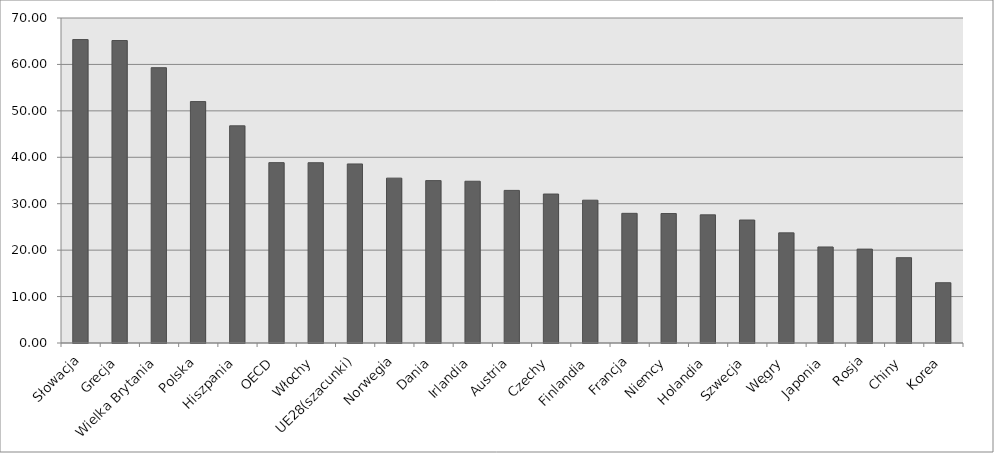
| Category | Udział badaczy w sz.w. (%) |
|---|---|
| Słowacja | 65.357 |
| Grecja | 65.15 |
| Wielka Brytania | 59.297 |
| Polska | 52.002 |
| Hiszpania | 46.777 |
| OECD | 38.848 |
| Włochy | 38.83 |
| UE28(szacunki) | 38.562 |
| Norwegia | 35.511 |
| Dania | 34.976 |
| Irlandia | 34.84 |
| Austria | 32.87 |
| Czechy | 32.083 |
| Finlandia | 30.758 |
| Francja | 27.926 |
| Niemcy | 27.888 |
| Holandia | 27.6 |
| Szwecja | 26.489 |
| Węgry | 23.72 |
| Japonia | 20.681 |
| Rosja | 20.22 |
| Chiny | 18.374 |
| Korea | 12.983 |